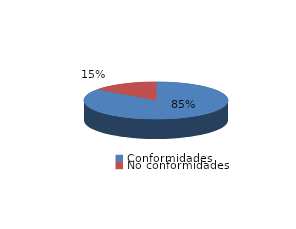
| Category | Series 0 |
|---|---|
| Conformidades | 743 |
| No conformidades | 130 |